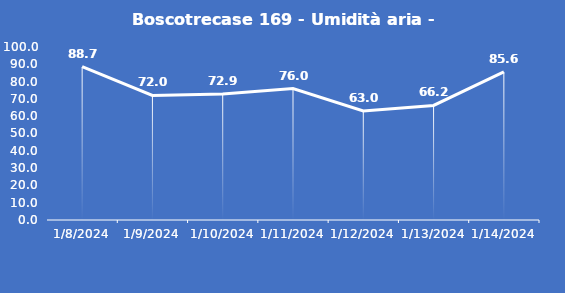
| Category | Boscotrecase 169 - Umidità aria - Grezzo (%) |
|---|---|
| 1/8/24 | 88.7 |
| 1/9/24 | 72 |
| 1/10/24 | 72.9 |
| 1/11/24 | 76 |
| 1/12/24 | 63 |
| 1/13/24 | 66.2 |
| 1/14/24 | 85.6 |